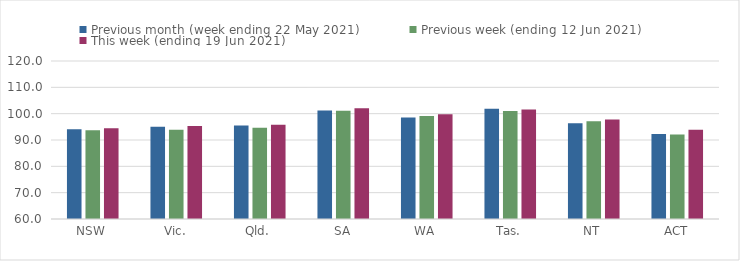
| Category | Previous month (week ending 22 May 2021) | Previous week (ending 12 Jun 2021) | This week (ending 19 Jun 2021) |
|---|---|---|---|
| NSW | 94.11 | 93.71 | 94.47 |
| Vic. | 95.06 | 93.85 | 95.31 |
| Qld. | 95.54 | 94.68 | 95.79 |
| SA | 101.21 | 101.14 | 102.05 |
| WA | 98.5 | 99.09 | 99.81 |
| Tas. | 101.86 | 101 | 101.55 |
| NT | 96.36 | 97.12 | 97.82 |
| ACT | 92.31 | 92.08 | 93.93 |